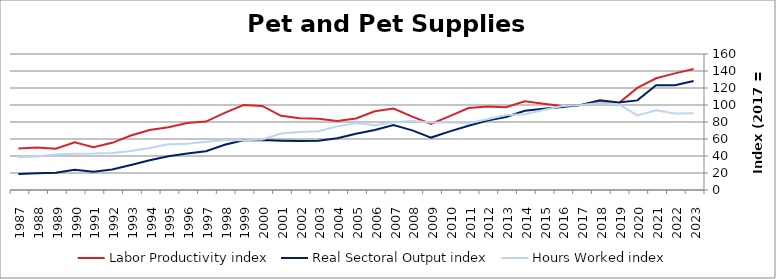
| Category | Labor Productivity index | Real Sectoral Output index | Hours Worked index |
|---|---|---|---|
| 2023.0 | 142.298 | 128.33 | 90.185 |
| 2022.0 | 137.226 | 123.339 | 89.88 |
| 2021.0 | 131.414 | 123.234 | 93.775 |
| 2020.0 | 120.144 | 105.416 | 87.741 |
| 2019.0 | 101.958 | 102.97 | 100.992 |
| 2018.0 | 103.169 | 105.468 | 102.229 |
| 2017.0 | 100 | 100 | 100 |
| 2016.0 | 98.839 | 97.61 | 98.757 |
| 2015.0 | 101.387 | 95.483 | 94.176 |
| 2014.0 | 104.415 | 93.166 | 89.227 |
| 2013.0 | 97.416 | 85.954 | 88.233 |
| 2012.0 | 98.152 | 81.64 | 83.177 |
| 2011.0 | 96.368 | 75.638 | 78.488 |
| 2010.0 | 86.851 | 68.945 | 79.382 |
| 2009.0 | 77.667 | 61.677 | 79.412 |
| 2008.0 | 86.406 | 70.112 | 81.143 |
| 2007.0 | 95.78 | 76.429 | 79.797 |
| 2006.0 | 92.64 | 70.652 | 76.266 |
| 2005.0 | 84.197 | 66.266 | 78.703 |
| 2004.0 | 81.286 | 60.835 | 74.841 |
| 2003.0 | 83.858 | 57.884 | 69.026 |
| 2002.0 | 84.494 | 57.569 | 68.134 |
| 2001.0 | 87.267 | 58.066 | 66.538 |
| 2000.0 | 98.875 | 58.807 | 59.476 |
| 1999.0 | 99.939 | 58.402 | 58.438 |
| 1998.0 | 90.792 | 53.2 | 58.595 |
| 1997.0 | 80.471 | 45.676 | 56.761 |
| 1996.0 | 78.899 | 42.86 | 54.323 |
| 1995.0 | 73.876 | 39.797 | 53.869 |
| 1994.0 | 70.672 | 34.89 | 49.369 |
| 1993.0 | 64.148 | 29.361 | 45.77 |
| 1992.0 | 55.488 | 24.195 | 43.604 |
| 1991.0 | 50.347 | 21.559 | 42.821 |
| 1990.0 | 56.145 | 23.935 | 42.631 |
| 1989.0 | 48.536 | 20.258 | 41.738 |
| 1988.0 | 50.141 | 19.786 | 39.46 |
| 1987.0 | 48.856 | 18.816 | 38.514 |